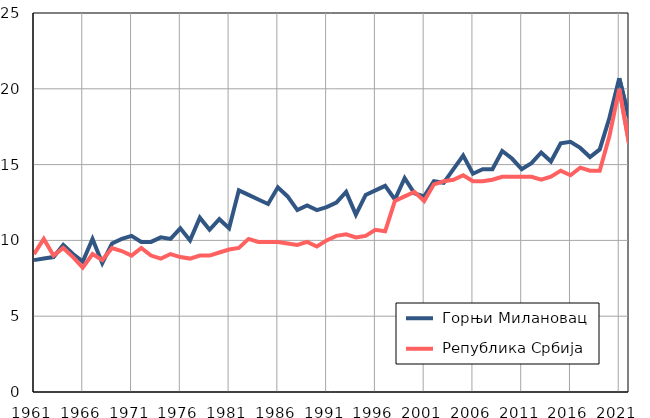
| Category |  Горњи Милановац |  Република Србија |
|---|---|---|
| 1961.0 | 8.7 | 9.1 |
| 1962.0 | 8.8 | 10.1 |
| 1963.0 | 8.9 | 9 |
| 1964.0 | 9.7 | 9.5 |
| 1965.0 | 9.1 | 8.9 |
| 1966.0 | 8.6 | 8.2 |
| 1967.0 | 10.1 | 9.1 |
| 1968.0 | 8.5 | 8.7 |
| 1969.0 | 9.8 | 9.5 |
| 1970.0 | 10.1 | 9.3 |
| 1971.0 | 10.3 | 9 |
| 1972.0 | 9.9 | 9.5 |
| 1973.0 | 9.9 | 9 |
| 1974.0 | 10.2 | 8.8 |
| 1975.0 | 10.1 | 9.1 |
| 1976.0 | 10.8 | 8.9 |
| 1977.0 | 10 | 8.8 |
| 1978.0 | 11.5 | 9 |
| 1979.0 | 10.7 | 9 |
| 1980.0 | 11.4 | 9.2 |
| 1981.0 | 10.8 | 9.4 |
| 1982.0 | 13.3 | 9.5 |
| 1983.0 | 13 | 10.1 |
| 1984.0 | 12.7 | 9.9 |
| 1985.0 | 12.4 | 9.9 |
| 1986.0 | 13.5 | 9.9 |
| 1987.0 | 12.9 | 9.8 |
| 1988.0 | 12 | 9.7 |
| 1989.0 | 12.3 | 9.9 |
| 1990.0 | 12 | 9.6 |
| 1991.0 | 12.2 | 10 |
| 1992.0 | 12.5 | 10.3 |
| 1993.0 | 13.2 | 10.4 |
| 1994.0 | 11.7 | 10.2 |
| 1995.0 | 13 | 10.3 |
| 1996.0 | 13.3 | 10.7 |
| 1997.0 | 13.6 | 10.6 |
| 1998.0 | 12.7 | 12.6 |
| 1999.0 | 14.1 | 12.9 |
| 2000.0 | 13.1 | 13.2 |
| 2001.0 | 12.9 | 12.6 |
| 2002.0 | 13.9 | 13.7 |
| 2003.0 | 13.8 | 13.9 |
| 2004.0 | 14.7 | 14 |
| 2005.0 | 15.6 | 14.3 |
| 2006.0 | 14.4 | 13.9 |
| 2007.0 | 14.7 | 13.9 |
| 2008.0 | 14.7 | 14 |
| 2009.0 | 15.9 | 14.2 |
| 2010.0 | 15.4 | 14.2 |
| 2011.0 | 14.7 | 14.2 |
| 2012.0 | 15.1 | 14.2 |
| 2013.0 | 15.8 | 14 |
| 2014.0 | 15.2 | 14.2 |
| 2015.0 | 16.4 | 14.6 |
| 2016.0 | 16.5 | 14.3 |
| 2017.0 | 16.1 | 14.8 |
| 2018.0 | 15.5 | 14.6 |
| 2019.0 | 16 | 14.6 |
| 2020.0 | 18.1 | 16.9 |
| 2021.0 | 20.7 | 20 |
| 2022.0 | 18.1 | 16.4 |